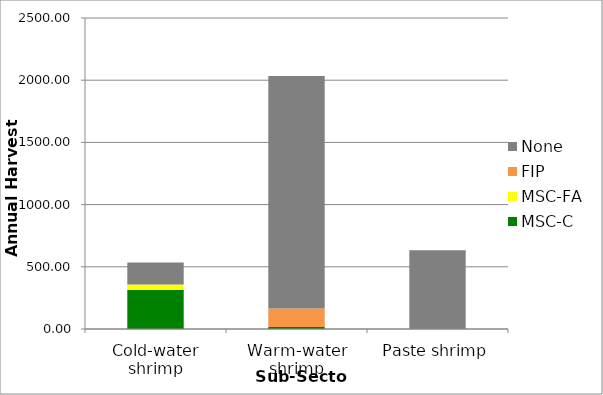
| Category | MSC-C | MSC-FA | FIP | None |
|---|---|---|---|---|
| Cold-water shrimp | 313.303 | 45.005 | 0 | 177.192 |
| Warm-water shrimp | 15.61 | 0 | 149.425 | 1869.665 |
| Paste shrimp | 0 | 0 | 0 | 633.1 |